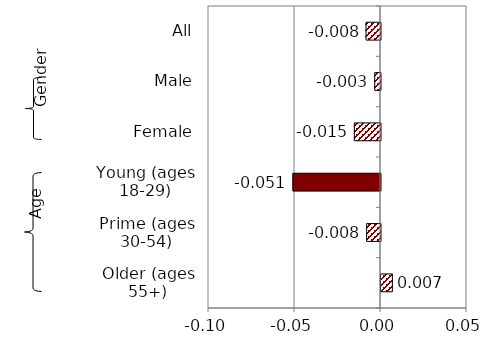
| Category | Series 0 |
|---|---|
| Older (ages 55+) | 0.007 |
| Prime (ages 30-54) | -0.008 |
| Young (ages 18-29) | -0.051 |
| Female | -0.015 |
| Male | -0.003 |
| All | -0.008 |